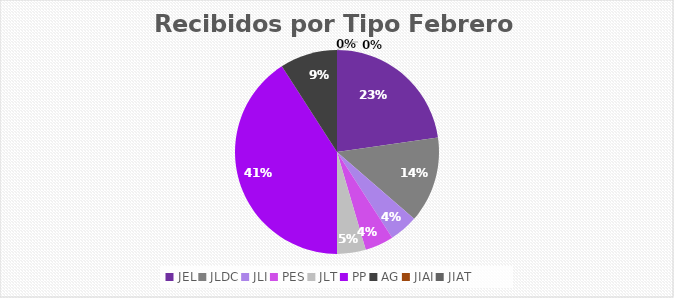
| Category | Series 0 |
|---|---|
| JEL | 5 |
| JLDC | 3 |
| JLI | 1 |
| PES | 1 |
| JLT | 1 |
| PP | 9 |
| AG | 2 |
| JIAI | 0 |
| JIAT | 0 |